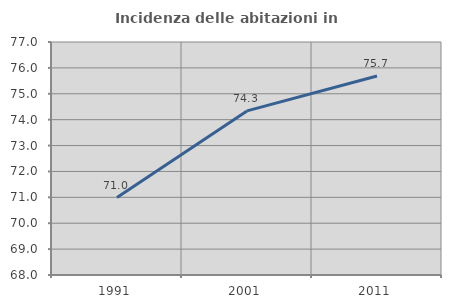
| Category | Incidenza delle abitazioni in proprietà  |
|---|---|
| 1991.0 | 70.993 |
| 2001.0 | 74.339 |
| 2011.0 | 75.685 |